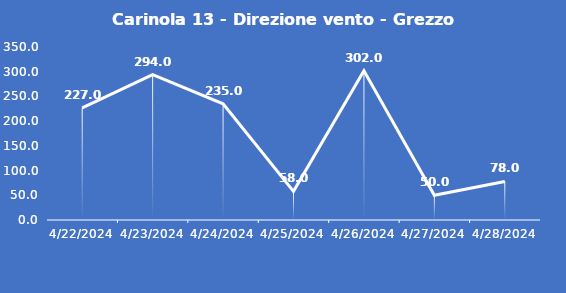
| Category | Carinola 13 - Direzione vento - Grezzo (°N) |
|---|---|
| 4/22/24 | 227 |
| 4/23/24 | 294 |
| 4/24/24 | 235 |
| 4/25/24 | 58 |
| 4/26/24 | 302 |
| 4/27/24 | 50 |
| 4/28/24 | 78 |